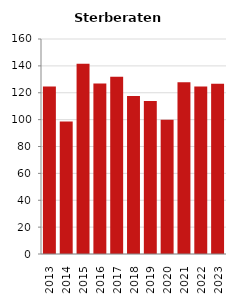
| Category | Sterberate der Bevölkerung ab 80 Jahre (auf Tsd.) |
|---|---|
| 2013.0 | 124.567 |
| 2014.0 | 98.684 |
| 2015.0 | 141.509 |
| 2016.0 | 126.888 |
| 2017.0 | 131.965 |
| 2018.0 | 117.647 |
| 2019.0 | 113.924 |
| 2020.0 | 100 |
| 2021.0 | 127.907 |
| 2022.0 | 124.706 |
| 2023.0 | 126.728 |